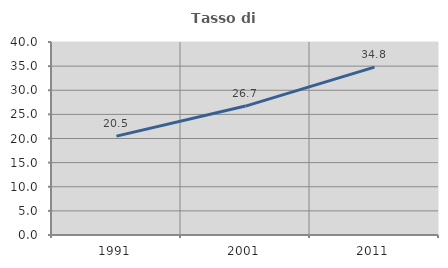
| Category | Tasso di occupazione   |
|---|---|
| 1991.0 | 20.486 |
| 2001.0 | 26.721 |
| 2011.0 | 34.783 |